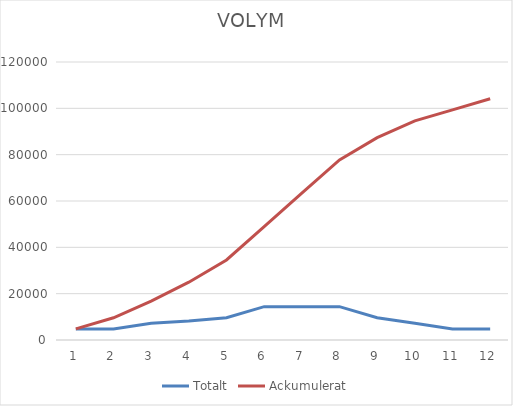
| Category | Totalt | Ackumulerat |
|---|---|---|
| 0 | 4800 | 4800 |
| 1 | 4800 | 9600 |
| 2 | 7200 | 16800 |
| 3 | 8160 | 24960 |
| 4 | 9600 | 34560 |
| 5 | 14400 | 48960 |
| 6 | 14400 | 63360 |
| 7 | 14400 | 77760 |
| 8 | 9600 | 87360 |
| 9 | 7200 | 94560 |
| 10 | 4800 | 99360 |
| 11 | 4800 | 104160 |